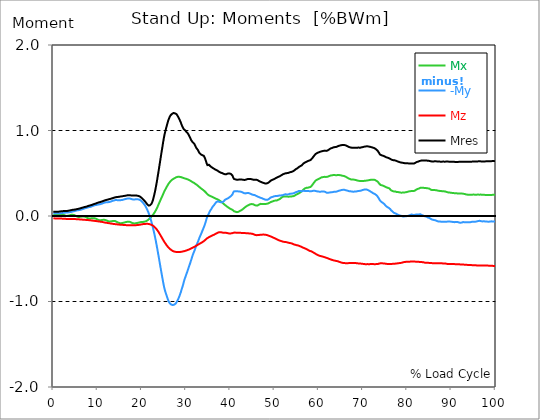
| Category |  Mx |  -My |  Mz |  Mres |
|---|---|---|---|---|
| 0.0 | 0.01 | 0.034 | -0.027 | 0.049 |
| 0.167348456675344 | 0.011 | 0.034 | -0.027 | 0.049 |
| 0.334696913350688 | 0.012 | 0.033 | -0.028 | 0.049 |
| 0.5020453700260321 | 0.014 | 0.032 | -0.028 | 0.049 |
| 0.669393826701376 | 0.016 | 0.033 | -0.028 | 0.05 |
| 0.83674228337672 | 0.016 | 0.033 | -0.028 | 0.05 |
| 1.0040907400520642 | 0.015 | 0.033 | -0.029 | 0.05 |
| 1.1621420602454444 | 0.016 | 0.032 | -0.029 | 0.05 |
| 1.3294905169207885 | 0.018 | 0.032 | -0.03 | 0.051 |
| 1.4968389735961325 | 0.02 | 0.032 | -0.03 | 0.052 |
| 1.6641874302714765 | 0.021 | 0.033 | -0.03 | 0.054 |
| 1.8315358869468206 | 0.021 | 0.033 | -0.031 | 0.054 |
| 1.9988843436221646 | 0.021 | 0.035 | -0.031 | 0.056 |
| 2.1662328002975086 | 0.018 | 0.036 | -0.032 | 0.057 |
| 2.333581256972853 | 0.014 | 0.038 | -0.032 | 0.058 |
| 2.5009297136481967 | 0.009 | 0.039 | -0.033 | 0.058 |
| 2.6682781703235405 | 0.006 | 0.039 | -0.033 | 0.057 |
| 2.8356266269988843 | 0.002 | 0.04 | -0.034 | 0.058 |
| 3.002975083674229 | 0.001 | 0.041 | -0.035 | 0.058 |
| 3.1703235403495724 | 0.001 | 0.041 | -0.035 | 0.06 |
| 3.337671997024917 | 0.003 | 0.042 | -0.036 | 0.061 |
| 3.4957233172182973 | 0.006 | 0.042 | -0.036 | 0.063 |
| 3.663071773893641 | 0.008 | 0.044 | -0.036 | 0.064 |
| 3.8304202305689854 | 0.011 | 0.045 | -0.036 | 0.066 |
| 3.997768687244329 | 0.013 | 0.047 | -0.036 | 0.068 |
| 4.165117143919673 | 0.014 | 0.05 | -0.036 | 0.07 |
| 4.332465600595017 | 0.015 | 0.052 | -0.036 | 0.072 |
| 4.499814057270361 | 0.014 | 0.054 | -0.036 | 0.073 |
| 4.667162513945706 | 0.011 | 0.056 | -0.036 | 0.074 |
| 4.834510970621049 | 0.008 | 0.059 | -0.036 | 0.075 |
| 5.001859427296393 | 0.004 | 0.061 | -0.036 | 0.077 |
| 5.169207883971737 | -0.001 | 0.064 | -0.036 | 0.078 |
| 5.336556340647081 | -0.006 | 0.065 | -0.037 | 0.08 |
| 5.503904797322425 | -0.009 | 0.066 | -0.037 | 0.081 |
| 5.671253253997769 | -0.012 | 0.068 | -0.038 | 0.084 |
| 5.82930457419115 | -0.012 | 0.069 | -0.039 | 0.086 |
| 5.996653030866494 | -0.01 | 0.071 | -0.04 | 0.089 |
| 6.164001487541838 | -0.009 | 0.074 | -0.041 | 0.091 |
| 6.331349944217181 | -0.007 | 0.076 | -0.041 | 0.093 |
| 6.498698400892526 | -0.006 | 0.079 | -0.042 | 0.096 |
| 6.66604685756787 | -0.005 | 0.081 | -0.043 | 0.099 |
| 6.833395314243213 | -0.006 | 0.085 | -0.043 | 0.102 |
| 7.000743770918558 | -0.006 | 0.088 | -0.044 | 0.105 |
| 7.168092227593902 | -0.009 | 0.091 | -0.045 | 0.107 |
| 7.335440684269246 | -0.012 | 0.093 | -0.046 | 0.107 |
| 7.50278914094459 | -0.018 | 0.096 | -0.046 | 0.11 |
| 7.6701375976199335 | -0.022 | 0.098 | -0.047 | 0.113 |
| 7.837486054295278 | -0.026 | 0.102 | -0.048 | 0.117 |
| 7.995537374488658 | -0.029 | 0.104 | -0.049 | 0.12 |
| 8.162885831164003 | -0.031 | 0.105 | -0.05 | 0.122 |
| 8.330234287839346 | -0.029 | 0.107 | -0.05 | 0.124 |
| 8.49758274451469 | -0.027 | 0.108 | -0.051 | 0.125 |
| 8.664931201190035 | -0.026 | 0.112 | -0.052 | 0.129 |
| 8.832279657865378 | -0.025 | 0.116 | -0.053 | 0.133 |
| 8.999628114540721 | -0.025 | 0.12 | -0.055 | 0.136 |
| 9.166976571216066 | -0.026 | 0.123 | -0.056 | 0.14 |
| 9.334325027891412 | -0.026 | 0.126 | -0.057 | 0.142 |
| 9.501673484566755 | -0.029 | 0.127 | -0.058 | 0.145 |
| 9.669021941242098 | -0.033 | 0.129 | -0.059 | 0.148 |
| 9.836370397917442 | -0.038 | 0.131 | -0.06 | 0.151 |
| 10.003718854592787 | -0.042 | 0.133 | -0.062 | 0.154 |
| 10.17106731126813 | -0.046 | 0.134 | -0.063 | 0.157 |
| 10.329118631461512 | -0.049 | 0.136 | -0.064 | 0.16 |
| 10.496467088136853 | -0.05 | 0.137 | -0.065 | 0.163 |
| 10.663815544812199 | -0.05 | 0.139 | -0.066 | 0.164 |
| 10.831164001487544 | -0.049 | 0.142 | -0.068 | 0.167 |
| 10.998512458162887 | -0.047 | 0.145 | -0.069 | 0.17 |
| 11.16586091483823 | -0.045 | 0.149 | -0.071 | 0.173 |
| 11.333209371513574 | -0.044 | 0.152 | -0.073 | 0.177 |
| 11.50055782818892 | -0.044 | 0.155 | -0.075 | 0.179 |
| 11.667906284864264 | -0.046 | 0.158 | -0.077 | 0.183 |
| 11.835254741539607 | -0.048 | 0.16 | -0.078 | 0.186 |
| 12.00260319821495 | -0.051 | 0.161 | -0.079 | 0.188 |
| 12.169951654890292 | -0.056 | 0.161 | -0.08 | 0.191 |
| 12.337300111565641 | -0.06 | 0.162 | -0.082 | 0.193 |
| 12.504648568240984 | -0.062 | 0.163 | -0.083 | 0.194 |
| 12.662699888434362 | -0.064 | 0.164 | -0.085 | 0.197 |
| 12.830048345109708 | -0.064 | 0.166 | -0.087 | 0.2 |
| 12.997396801785053 | -0.063 | 0.169 | -0.088 | 0.202 |
| 13.164745258460396 | -0.062 | 0.172 | -0.089 | 0.205 |
| 13.33209371513574 | -0.06 | 0.176 | -0.091 | 0.207 |
| 13.499442171811083 | -0.059 | 0.179 | -0.092 | 0.211 |
| 13.666790628486426 | -0.059 | 0.181 | -0.093 | 0.213 |
| 13.834139085161771 | -0.059 | 0.184 | -0.094 | 0.217 |
| 14.001487541837117 | -0.06 | 0.186 | -0.095 | 0.219 |
| 14.16883599851246 | -0.064 | 0.187 | -0.096 | 0.221 |
| 14.336184455187803 | -0.068 | 0.186 | -0.097 | 0.221 |
| 14.503532911863147 | -0.073 | 0.185 | -0.098 | 0.222 |
| 14.670881368538492 | -0.077 | 0.184 | -0.099 | 0.223 |
| 14.828932688731873 | -0.08 | 0.183 | -0.1 | 0.224 |
| 14.996281145407215 | -0.083 | 0.184 | -0.101 | 0.226 |
| 15.163629602082558 | -0.085 | 0.186 | -0.101 | 0.229 |
| 15.330978058757903 | -0.084 | 0.186 | -0.102 | 0.229 |
| 15.498326515433247 | -0.083 | 0.187 | -0.103 | 0.23 |
| 15.665674972108594 | -0.081 | 0.189 | -0.104 | 0.232 |
| 15.833023428783937 | -0.079 | 0.192 | -0.105 | 0.233 |
| 16.00037188545928 | -0.077 | 0.194 | -0.106 | 0.235 |
| 16.167720342134626 | -0.074 | 0.196 | -0.106 | 0.236 |
| 16.335068798809967 | -0.072 | 0.199 | -0.107 | 0.237 |
| 16.502417255485312 | -0.07 | 0.201 | -0.107 | 0.239 |
| 16.669765712160658 | -0.068 | 0.203 | -0.107 | 0.241 |
| 16.837114168836 | -0.067 | 0.205 | -0.108 | 0.242 |
| 17.004462625511344 | -0.067 | 0.206 | -0.108 | 0.243 |
| 17.16251394570472 | -0.067 | 0.206 | -0.108 | 0.243 |
| 17.32986240238007 | -0.069 | 0.204 | -0.108 | 0.242 |
| 17.497210859055414 | -0.073 | 0.201 | -0.108 | 0.241 |
| 17.664559315730756 | -0.078 | 0.198 | -0.108 | 0.24 |
| 17.8319077724061 | -0.081 | 0.196 | -0.108 | 0.239 |
| 17.999256229081443 | -0.085 | 0.193 | -0.108 | 0.238 |
| 18.166604685756788 | -0.088 | 0.192 | -0.108 | 0.238 |
| 18.333953142432133 | -0.087 | 0.193 | -0.108 | 0.239 |
| 18.501301599107478 | -0.086 | 0.194 | -0.107 | 0.239 |
| 18.668650055782823 | -0.084 | 0.196 | -0.107 | 0.24 |
| 18.835998512458165 | -0.083 | 0.195 | -0.107 | 0.238 |
| 19.00334696913351 | -0.081 | 0.195 | -0.106 | 0.237 |
| 19.170695425808855 | -0.079 | 0.196 | -0.105 | 0.236 |
| 19.338043882484197 | -0.077 | 0.193 | -0.104 | 0.234 |
| 19.496095202677576 | -0.075 | 0.192 | -0.102 | 0.231 |
| 19.66344365935292 | -0.072 | 0.186 | -0.101 | 0.224 |
| 19.830792116028263 | -0.07 | 0.179 | -0.099 | 0.218 |
| 19.998140572703612 | -0.07 | 0.17 | -0.097 | 0.209 |
| 20.165489029378953 | -0.069 | 0.16 | -0.096 | 0.201 |
| 20.3328374860543 | -0.069 | 0.15 | -0.094 | 0.193 |
| 20.500185942729644 | -0.067 | 0.14 | -0.093 | 0.183 |
| 20.667534399404985 | -0.065 | 0.128 | -0.093 | 0.174 |
| 20.83488285608033 | -0.063 | 0.114 | -0.093 | 0.164 |
| 21.002231312755672 | -0.06 | 0.098 | -0.092 | 0.152 |
| 21.16957976943102 | -0.054 | 0.08 | -0.092 | 0.14 |
| 21.336928226106362 | -0.049 | 0.061 | -0.092 | 0.13 |
| 21.504276682781704 | -0.042 | 0.04 | -0.093 | 0.123 |
| 21.67162513945705 | -0.035 | 0.017 | -0.094 | 0.121 |
| 21.82967645965043 | -0.026 | -0.009 | -0.097 | 0.124 |
| 21.997024916325774 | -0.018 | -0.037 | -0.1 | 0.13 |
| 22.16437337300112 | -0.008 | -0.066 | -0.103 | 0.141 |
| 22.33172182967646 | 0.002 | -0.099 | -0.107 | 0.16 |
| 22.499070286351806 | 0.012 | -0.133 | -0.113 | 0.184 |
| 22.666418743027148 | 0.024 | -0.17 | -0.119 | 0.216 |
| 22.833767199702496 | 0.037 | -0.208 | -0.126 | 0.251 |
| 23.00111565637784 | 0.051 | -0.25 | -0.135 | 0.292 |
| 23.168464113053183 | 0.066 | -0.292 | -0.144 | 0.336 |
| 23.335812569728528 | 0.083 | -0.337 | -0.154 | 0.382 |
| 23.50316102640387 | 0.101 | -0.384 | -0.165 | 0.433 |
| 23.670509483079215 | 0.121 | -0.434 | -0.179 | 0.487 |
| 23.83785793975456 | 0.141 | -0.481 | -0.192 | 0.539 |
| 23.995909259947936 | 0.161 | -0.533 | -0.207 | 0.594 |
| 24.163257716623285 | 0.18 | -0.582 | -0.221 | 0.65 |
| 24.330606173298627 | 0.2 | -0.633 | -0.236 | 0.706 |
| 24.49795462997397 | 0.219 | -0.681 | -0.25 | 0.759 |
| 24.665303086649313 | 0.237 | -0.729 | -0.265 | 0.812 |
| 24.83265154332466 | 0.258 | -0.778 | -0.28 | 0.867 |
| 25.0 | 0.278 | -0.821 | -0.295 | 0.917 |
| 25.167348456675345 | 0.295 | -0.858 | -0.308 | 0.959 |
| 25.334696913350694 | 0.312 | -0.889 | -0.321 | 0.996 |
| 25.502045370026035 | 0.328 | -0.915 | -0.334 | 1.028 |
| 25.669393826701377 | 0.344 | -0.94 | -0.346 | 1.06 |
| 25.836742283376722 | 0.359 | -0.966 | -0.357 | 1.092 |
| 26.004090740052067 | 0.374 | -0.99 | -0.367 | 1.121 |
| 26.17143919672741 | 0.386 | -1.007 | -0.376 | 1.143 |
| 26.329490516920792 | 0.397 | -1.021 | -0.384 | 1.163 |
| 26.49683897359613 | 0.407 | -1.032 | -0.392 | 1.178 |
| 26.66418743027148 | 0.416 | -1.036 | -0.398 | 1.187 |
| 26.831535886946828 | 0.423 | -1.04 | -0.404 | 1.194 |
| 26.998884343622166 | 0.43 | -1.042 | -0.409 | 1.201 |
| 27.166232800297514 | 0.436 | -1.042 | -0.412 | 1.205 |
| 27.333581256972852 | 0.44 | -1.036 | -0.416 | 1.202 |
| 27.5009297136482 | 0.445 | -1.032 | -0.418 | 1.201 |
| 27.668278170323543 | 0.45 | -1.023 | -0.42 | 1.196 |
| 27.835626626998888 | 0.454 | -1.015 | -0.421 | 1.192 |
| 28.002975083674233 | 0.457 | -0.996 | -0.421 | 1.179 |
| 28.170323540349575 | 0.459 | -0.979 | -0.422 | 1.164 |
| 28.33767199702492 | 0.459 | -0.959 | -0.422 | 1.149 |
| 28.50502045370026 | 0.458 | -0.938 | -0.421 | 1.132 |
| 28.663071773893645 | 0.456 | -0.912 | -0.421 | 1.11 |
| 28.830420230568986 | 0.455 | -0.891 | -0.419 | 1.093 |
| 28.99776868724433 | 0.451 | -0.857 | -0.418 | 1.066 |
| 29.165117143919673 | 0.45 | -0.833 | -0.416 | 1.048 |
| 29.33246560059502 | 0.447 | -0.803 | -0.414 | 1.03 |
| 29.499814057270367 | 0.443 | -0.769 | -0.412 | 1.015 |
| 29.66716251394571 | 0.439 | -0.74 | -0.41 | 1.006 |
| 29.834510970621054 | 0.437 | -0.716 | -0.407 | 1.001 |
| 30.00185942729639 | 0.435 | -0.692 | -0.405 | 0.989 |
| 30.169207883971744 | 0.433 | -0.667 | -0.401 | 0.981 |
| 30.33655634064708 | 0.429 | -0.642 | -0.398 | 0.971 |
| 30.50390479732243 | 0.425 | -0.618 | -0.395 | 0.959 |
| 30.671253253997772 | 0.421 | -0.592 | -0.392 | 0.941 |
| 30.829304574191156 | 0.417 | -0.566 | -0.388 | 0.923 |
| 30.996653030866494 | 0.412 | -0.54 | -0.383 | 0.907 |
| 31.164001487541842 | 0.407 | -0.513 | -0.379 | 0.887 |
| 31.331349944217187 | 0.401 | -0.486 | -0.375 | 0.875 |
| 31.498698400892525 | 0.395 | -0.459 | -0.371 | 0.863 |
| 31.666046857567874 | 0.391 | -0.436 | -0.366 | 0.852 |
| 31.833395314243212 | 0.386 | -0.415 | -0.362 | 0.846 |
| 32.00074377091856 | 0.381 | -0.393 | -0.357 | 0.832 |
| 32.1680922275939 | 0.374 | -0.365 | -0.352 | 0.811 |
| 32.33544068426925 | 0.366 | -0.341 | -0.348 | 0.795 |
| 32.50278914094459 | 0.362 | -0.324 | -0.342 | 0.787 |
| 32.670137597619934 | 0.355 | -0.304 | -0.336 | 0.773 |
| 32.83748605429528 | 0.347 | -0.281 | -0.332 | 0.755 |
| 33.004834510970625 | 0.34 | -0.258 | -0.326 | 0.739 |
| 33.162885831164004 | 0.332 | -0.237 | -0.321 | 0.728 |
| 33.33023428783935 | 0.324 | -0.219 | -0.317 | 0.721 |
| 33.497582744514695 | 0.319 | -0.198 | -0.312 | 0.715 |
| 33.664931201190036 | 0.312 | -0.177 | -0.307 | 0.711 |
| 33.83227965786538 | 0.306 | -0.155 | -0.301 | 0.708 |
| 33.99962811454073 | 0.299 | -0.135 | -0.295 | 0.705 |
| 34.16697657121607 | 0.292 | -0.112 | -0.288 | 0.689 |
| 34.33432502789141 | 0.284 | -0.087 | -0.28 | 0.668 |
| 34.50167348456676 | 0.274 | -0.058 | -0.272 | 0.643 |
| 34.6690219412421 | 0.264 | -0.028 | -0.264 | 0.615 |
| 34.83637039791744 | 0.254 | -0.003 | -0.258 | 0.595 |
| 35.00371885459279 | 0.249 | 0.014 | -0.253 | 0.596 |
| 35.17106731126814 | 0.242 | 0.03 | -0.249 | 0.599 |
| 35.338415767943474 | 0.236 | 0.051 | -0.243 | 0.589 |
| 35.49646708813686 | 0.233 | 0.065 | -0.238 | 0.582 |
| 35.6638155448122 | 0.232 | 0.078 | -0.235 | 0.578 |
| 35.831164001487544 | 0.226 | 0.093 | -0.23 | 0.568 |
| 35.998512458162885 | 0.221 | 0.107 | -0.226 | 0.559 |
| 36.165860914838234 | 0.218 | 0.117 | -0.222 | 0.558 |
| 36.333209371513576 | 0.213 | 0.127 | -0.219 | 0.556 |
| 36.50055782818892 | 0.208 | 0.14 | -0.214 | 0.547 |
| 36.667906284864266 | 0.205 | 0.151 | -0.209 | 0.541 |
| 36.83525474153961 | 0.201 | 0.163 | -0.205 | 0.538 |
| 37.002603198214956 | 0.198 | 0.172 | -0.2 | 0.535 |
| 37.1699516548903 | 0.193 | 0.172 | -0.196 | 0.529 |
| 37.337300111565646 | 0.189 | 0.168 | -0.192 | 0.521 |
| 37.50464856824098 | 0.183 | 0.165 | -0.19 | 0.516 |
| 37.66269988843437 | 0.178 | 0.164 | -0.19 | 0.511 |
| 37.83004834510971 | 0.172 | 0.162 | -0.19 | 0.507 |
| 37.99739680178505 | 0.165 | 0.163 | -0.191 | 0.506 |
| 38.16474525846039 | 0.158 | 0.162 | -0.193 | 0.502 |
| 38.33209371513574 | 0.15 | 0.164 | -0.195 | 0.498 |
| 38.49944217181109 | 0.142 | 0.171 | -0.197 | 0.493 |
| 38.666790628486424 | 0.135 | 0.18 | -0.197 | 0.489 |
| 38.83413908516178 | 0.128 | 0.191 | -0.196 | 0.488 |
| 39.001487541837115 | 0.121 | 0.197 | -0.196 | 0.489 |
| 39.16883599851246 | 0.114 | 0.199 | -0.198 | 0.49 |
| 39.336184455187805 | 0.108 | 0.204 | -0.199 | 0.493 |
| 39.503532911863154 | 0.102 | 0.207 | -0.202 | 0.498 |
| 39.670881368538495 | 0.094 | 0.213 | -0.204 | 0.5 |
| 39.83822982521384 | 0.09 | 0.221 | -0.205 | 0.498 |
| 39.996281145407224 | 0.085 | 0.229 | -0.204 | 0.494 |
| 40.163629602082565 | 0.08 | 0.234 | -0.204 | 0.491 |
| 40.33097805875791 | 0.076 | 0.236 | -0.203 | 0.485 |
| 40.498326515433256 | 0.072 | 0.253 | -0.202 | 0.472 |
| 40.6656749721086 | 0.064 | 0.275 | -0.197 | 0.45 |
| 40.83302342878393 | 0.056 | 0.288 | -0.193 | 0.434 |
| 41.00037188545929 | 0.052 | 0.289 | -0.193 | 0.429 |
| 41.16772034213463 | 0.05 | 0.289 | -0.195 | 0.428 |
| 41.33506879880997 | 0.048 | 0.289 | -0.195 | 0.426 |
| 41.50241725548531 | 0.045 | 0.29 | -0.195 | 0.424 |
| 41.66976571216066 | 0.047 | 0.289 | -0.195 | 0.423 |
| 41.837114168836 | 0.049 | 0.288 | -0.196 | 0.425 |
| 42.004462625511344 | 0.053 | 0.289 | -0.196 | 0.426 |
| 42.17181108218669 | 0.059 | 0.287 | -0.196 | 0.427 |
| 42.32986240238007 | 0.065 | 0.283 | -0.197 | 0.427 |
| 42.497210859055414 | 0.067 | 0.282 | -0.197 | 0.427 |
| 42.66455931573076 | 0.074 | 0.279 | -0.198 | 0.425 |
| 42.831907772406105 | 0.08 | 0.275 | -0.198 | 0.424 |
| 42.999256229081446 | 0.087 | 0.27 | -0.198 | 0.422 |
| 43.16660468575679 | 0.094 | 0.266 | -0.199 | 0.421 |
| 43.33395314243214 | 0.102 | 0.263 | -0.2 | 0.421 |
| 43.50130159910748 | 0.108 | 0.264 | -0.201 | 0.424 |
| 43.66865005578282 | 0.114 | 0.267 | -0.201 | 0.427 |
| 43.83599851245817 | 0.12 | 0.269 | -0.202 | 0.431 |
| 44.00334696913351 | 0.124 | 0.27 | -0.203 | 0.434 |
| 44.17069542580886 | 0.129 | 0.268 | -0.203 | 0.434 |
| 44.3380438824842 | 0.133 | 0.264 | -0.204 | 0.433 |
| 44.49609520267758 | 0.136 | 0.262 | -0.205 | 0.434 |
| 44.66344365935292 | 0.139 | 0.258 | -0.206 | 0.433 |
| 44.83079211602827 | 0.139 | 0.253 | -0.207 | 0.43 |
| 44.99814057270361 | 0.14 | 0.25 | -0.208 | 0.427 |
| 45.16548902937895 | 0.138 | 0.248 | -0.21 | 0.425 |
| 45.332837486054295 | 0.133 | 0.247 | -0.215 | 0.424 |
| 45.500185942729644 | 0.128 | 0.245 | -0.22 | 0.425 |
| 45.66753439940499 | 0.125 | 0.241 | -0.222 | 0.426 |
| 45.83488285608033 | 0.122 | 0.236 | -0.223 | 0.425 |
| 46.00223131275568 | 0.122 | 0.231 | -0.224 | 0.421 |
| 46.16957976943102 | 0.122 | 0.228 | -0.223 | 0.42 |
| 46.336928226106366 | 0.127 | 0.224 | -0.222 | 0.415 |
| 46.50427668278171 | 0.134 | 0.221 | -0.221 | 0.409 |
| 46.671625139457056 | 0.139 | 0.217 | -0.221 | 0.406 |
| 46.829676459650436 | 0.142 | 0.213 | -0.22 | 0.401 |
| 46.99702491632577 | 0.142 | 0.208 | -0.219 | 0.396 |
| 47.16437337300112 | 0.139 | 0.207 | -0.218 | 0.393 |
| 47.33172182967646 | 0.139 | 0.204 | -0.218 | 0.39 |
| 47.49907028635181 | 0.139 | 0.2 | -0.218 | 0.387 |
| 47.66641874302716 | 0.139 | 0.196 | -0.218 | 0.384 |
| 47.83376719970249 | 0.14 | 0.193 | -0.219 | 0.381 |
| 48.001115656377834 | 0.141 | 0.19 | -0.22 | 0.379 |
| 48.16846411305319 | 0.142 | 0.189 | -0.221 | 0.38 |
| 48.33581256972853 | 0.142 | 0.19 | -0.223 | 0.382 |
| 48.50316102640387 | 0.146 | 0.192 | -0.226 | 0.386 |
| 48.67050948307921 | 0.15 | 0.195 | -0.23 | 0.391 |
| 48.837857939754564 | 0.154 | 0.203 | -0.233 | 0.398 |
| 49.005206396429905 | 0.159 | 0.21 | -0.236 | 0.406 |
| 49.163257716623285 | 0.164 | 0.218 | -0.239 | 0.414 |
| 49.33060617329863 | 0.166 | 0.221 | -0.243 | 0.419 |
| 49.49795462997397 | 0.169 | 0.222 | -0.248 | 0.422 |
| 49.66530308664932 | 0.174 | 0.227 | -0.251 | 0.426 |
| 49.832651543324666 | 0.177 | 0.229 | -0.255 | 0.43 |
| 50.0 | 0.178 | 0.23 | -0.259 | 0.435 |
| 50.16734845667534 | 0.18 | 0.233 | -0.263 | 0.439 |
| 50.33469691335069 | 0.18 | 0.234 | -0.267 | 0.444 |
| 50.50204537002604 | 0.181 | 0.234 | -0.272 | 0.449 |
| 50.66939382670139 | 0.184 | 0.235 | -0.277 | 0.453 |
| 50.836742283376715 | 0.19 | 0.236 | -0.28 | 0.457 |
| 51.00409074005207 | 0.193 | 0.236 | -0.284 | 0.461 |
| 51.17143919672741 | 0.197 | 0.241 | -0.287 | 0.464 |
| 51.32949051692079 | 0.201 | 0.246 | -0.29 | 0.469 |
| 51.496838973596134 | 0.211 | 0.241 | -0.293 | 0.475 |
| 51.66418743027148 | 0.221 | 0.241 | -0.296 | 0.482 |
| 51.831535886946824 | 0.224 | 0.243 | -0.299 | 0.486 |
| 51.99888434362217 | 0.227 | 0.246 | -0.301 | 0.49 |
| 52.16623280029752 | 0.228 | 0.25 | -0.302 | 0.493 |
| 52.33358125697285 | 0.229 | 0.251 | -0.304 | 0.496 |
| 52.5009297136482 | 0.229 | 0.254 | -0.305 | 0.499 |
| 52.668278170323546 | 0.228 | 0.253 | -0.306 | 0.501 |
| 52.835626626998895 | 0.227 | 0.251 | -0.307 | 0.502 |
| 53.00297508367424 | 0.227 | 0.251 | -0.31 | 0.503 |
| 53.17032354034958 | 0.226 | 0.253 | -0.312 | 0.505 |
| 53.33767199702492 | 0.226 | 0.258 | -0.315 | 0.509 |
| 53.50502045370027 | 0.227 | 0.261 | -0.316 | 0.512 |
| 53.663071773893655 | 0.228 | 0.262 | -0.318 | 0.514 |
| 53.83042023056899 | 0.229 | 0.262 | -0.321 | 0.516 |
| 53.99776868724433 | 0.23 | 0.263 | -0.322 | 0.519 |
| 54.16511714391967 | 0.231 | 0.264 | -0.326 | 0.522 |
| 54.33246560059503 | 0.233 | 0.266 | -0.331 | 0.527 |
| 54.49981405727037 | 0.236 | 0.27 | -0.335 | 0.534 |
| 54.667162513945705 | 0.242 | 0.276 | -0.336 | 0.542 |
| 54.834510970621054 | 0.248 | 0.279 | -0.338 | 0.549 |
| 55.0018594272964 | 0.251 | 0.28 | -0.341 | 0.553 |
| 55.169207883971744 | 0.256 | 0.283 | -0.343 | 0.558 |
| 55.336556340647086 | 0.261 | 0.29 | -0.345 | 0.566 |
| 55.50390479732243 | 0.265 | 0.293 | -0.348 | 0.572 |
| 55.671253253997776 | 0.271 | 0.294 | -0.351 | 0.579 |
| 55.83860171067312 | 0.277 | 0.293 | -0.355 | 0.583 |
| 55.9966530308665 | 0.282 | 0.289 | -0.358 | 0.586 |
| 56.16400148754184 | 0.29 | 0.288 | -0.363 | 0.593 |
| 56.33134994421718 | 0.297 | 0.293 | -0.367 | 0.602 |
| 56.498698400892536 | 0.307 | 0.295 | -0.371 | 0.612 |
| 56.66604685756788 | 0.316 | 0.296 | -0.375 | 0.621 |
| 56.83339531424321 | 0.321 | 0.293 | -0.378 | 0.624 |
| 57.00074377091856 | 0.326 | 0.293 | -0.381 | 0.629 |
| 57.16809222759391 | 0.329 | 0.293 | -0.385 | 0.633 |
| 57.33544068426925 | 0.33 | 0.293 | -0.39 | 0.637 |
| 57.5027891409446 | 0.33 | 0.293 | -0.396 | 0.641 |
| 57.670137597619934 | 0.334 | 0.293 | -0.4 | 0.647 |
| 57.83748605429528 | 0.336 | 0.291 | -0.404 | 0.649 |
| 58.004834510970625 | 0.337 | 0.289 | -0.408 | 0.65 |
| 58.16288583116401 | 0.34 | 0.289 | -0.411 | 0.655 |
| 58.330234287839346 | 0.349 | 0.289 | -0.413 | 0.662 |
| 58.497582744514695 | 0.36 | 0.292 | -0.418 | 0.673 |
| 58.66493120119004 | 0.371 | 0.294 | -0.423 | 0.685 |
| 58.832279657865385 | 0.383 | 0.295 | -0.428 | 0.696 |
| 58.999628114540734 | 0.395 | 0.294 | -0.433 | 0.707 |
| 59.16697657121607 | 0.406 | 0.294 | -0.438 | 0.718 |
| 59.33432502789142 | 0.416 | 0.292 | -0.444 | 0.727 |
| 59.50167348456676 | 0.421 | 0.29 | -0.449 | 0.732 |
| 59.66902194124211 | 0.425 | 0.289 | -0.453 | 0.736 |
| 59.83637039791745 | 0.43 | 0.287 | -0.457 | 0.741 |
| 60.00371885459278 | 0.435 | 0.285 | -0.462 | 0.745 |
| 60.17106731126813 | 0.438 | 0.284 | -0.464 | 0.748 |
| 60.33841576794349 | 0.443 | 0.285 | -0.467 | 0.751 |
| 60.49646708813685 | 0.45 | 0.285 | -0.47 | 0.754 |
| 60.6638155448122 | 0.452 | 0.286 | -0.472 | 0.757 |
| 60.831164001487544 | 0.454 | 0.287 | -0.474 | 0.759 |
| 60.99851245816289 | 0.455 | 0.288 | -0.476 | 0.761 |
| 61.16586091483824 | 0.457 | 0.287 | -0.479 | 0.763 |
| 61.333209371513576 | 0.458 | 0.286 | -0.482 | 0.764 |
| 61.50055782818892 | 0.457 | 0.281 | -0.485 | 0.763 |
| 61.667906284864266 | 0.457 | 0.274 | -0.488 | 0.762 |
| 61.835254741539615 | 0.458 | 0.271 | -0.491 | 0.764 |
| 62.002603198214956 | 0.459 | 0.271 | -0.493 | 0.766 |
| 62.16995165489029 | 0.464 | 0.273 | -0.497 | 0.773 |
| 62.33730011156564 | 0.466 | 0.273 | -0.501 | 0.778 |
| 62.504648568240995 | 0.469 | 0.275 | -0.505 | 0.783 |
| 62.67199702491633 | 0.474 | 0.278 | -0.507 | 0.79 |
| 62.83004834510971 | 0.475 | 0.279 | -0.51 | 0.793 |
| 62.99739680178505 | 0.476 | 0.279 | -0.513 | 0.795 |
| 63.1647452584604 | 0.478 | 0.279 | -0.516 | 0.799 |
| 63.33209371513575 | 0.479 | 0.283 | -0.519 | 0.803 |
| 63.4994421718111 | 0.479 | 0.284 | -0.521 | 0.806 |
| 63.666790628486424 | 0.479 | 0.284 | -0.522 | 0.807 |
| 63.83413908516177 | 0.477 | 0.283 | -0.524 | 0.807 |
| 64.00148754183712 | 0.477 | 0.284 | -0.526 | 0.808 |
| 64.16883599851248 | 0.478 | 0.288 | -0.528 | 0.812 |
| 64.3361844551878 | 0.479 | 0.293 | -0.53 | 0.817 |
| 64.50353291186315 | 0.479 | 0.294 | -0.534 | 0.821 |
| 64.6708813685385 | 0.479 | 0.297 | -0.536 | 0.822 |
| 64.83822982521384 | 0.477 | 0.299 | -0.539 | 0.824 |
| 65.00557828188919 | 0.476 | 0.301 | -0.542 | 0.827 |
| 65.16362960208257 | 0.474 | 0.304 | -0.545 | 0.829 |
| 65.3309780587579 | 0.471 | 0.306 | -0.548 | 0.831 |
| 65.49832651543326 | 0.469 | 0.307 | -0.55 | 0.832 |
| 65.6656749721086 | 0.468 | 0.307 | -0.55 | 0.831 |
| 65.83302342878395 | 0.464 | 0.306 | -0.55 | 0.83 |
| 66.00037188545929 | 0.462 | 0.305 | -0.551 | 0.828 |
| 66.16772034213463 | 0.457 | 0.301 | -0.551 | 0.824 |
| 66.33506879880998 | 0.452 | 0.299 | -0.551 | 0.821 |
| 66.50241725548531 | 0.447 | 0.296 | -0.551 | 0.816 |
| 66.66976571216065 | 0.442 | 0.294 | -0.551 | 0.812 |
| 66.83711416883601 | 0.437 | 0.291 | -0.551 | 0.807 |
| 67.00446262551135 | 0.434 | 0.289 | -0.55 | 0.804 |
| 67.1718110821867 | 0.43 | 0.289 | -0.549 | 0.801 |
| 67.32986240238007 | 0.427 | 0.288 | -0.549 | 0.8 |
| 67.49721085905541 | 0.427 | 0.286 | -0.549 | 0.799 |
| 67.66455931573076 | 0.426 | 0.284 | -0.549 | 0.798 |
| 67.83190777240611 | 0.425 | 0.284 | -0.549 | 0.798 |
| 67.99925622908145 | 0.425 | 0.285 | -0.55 | 0.798 |
| 68.16660468575678 | 0.423 | 0.286 | -0.55 | 0.799 |
| 68.33395314243214 | 0.421 | 0.287 | -0.55 | 0.798 |
| 68.50130159910749 | 0.419 | 0.287 | -0.551 | 0.798 |
| 68.66865005578282 | 0.416 | 0.288 | -0.552 | 0.798 |
| 68.83599851245816 | 0.414 | 0.292 | -0.554 | 0.799 |
| 69.00334696913352 | 0.412 | 0.294 | -0.555 | 0.801 |
| 69.17069542580886 | 0.411 | 0.293 | -0.555 | 0.8 |
| 69.3380438824842 | 0.409 | 0.293 | -0.555 | 0.798 |
| 69.50539233915956 | 0.408 | 0.295 | -0.557 | 0.8 |
| 69.66344365935292 | 0.409 | 0.299 | -0.558 | 0.803 |
| 69.83079211602826 | 0.408 | 0.303 | -0.559 | 0.805 |
| 69.99814057270362 | 0.409 | 0.306 | -0.56 | 0.807 |
| 70.16548902937896 | 0.41 | 0.307 | -0.561 | 0.809 |
| 70.33283748605429 | 0.411 | 0.309 | -0.563 | 0.811 |
| 70.50018594272964 | 0.411 | 0.311 | -0.563 | 0.813 |
| 70.667534399405 | 0.413 | 0.31 | -0.564 | 0.814 |
| 70.83488285608033 | 0.414 | 0.309 | -0.564 | 0.815 |
| 71.00223131275568 | 0.416 | 0.307 | -0.563 | 0.815 |
| 71.16957976943102 | 0.417 | 0.303 | -0.564 | 0.813 |
| 71.33692822610637 | 0.419 | 0.299 | -0.564 | 0.812 |
| 71.50427668278171 | 0.421 | 0.293 | -0.564 | 0.81 |
| 71.67162513945706 | 0.422 | 0.288 | -0.563 | 0.808 |
| 71.8389735961324 | 0.424 | 0.282 | -0.563 | 0.807 |
| 71.99702491632577 | 0.425 | 0.277 | -0.563 | 0.804 |
| 72.16437337300113 | 0.424 | 0.271 | -0.563 | 0.8 |
| 72.33172182967647 | 0.424 | 0.266 | -0.563 | 0.798 |
| 72.49907028635181 | 0.423 | 0.262 | -0.563 | 0.794 |
| 72.66641874302715 | 0.422 | 0.257 | -0.564 | 0.792 |
| 72.8337671997025 | 0.419 | 0.252 | -0.564 | 0.787 |
| 73.00111565637783 | 0.413 | 0.246 | -0.563 | 0.779 |
| 73.16846411305319 | 0.407 | 0.237 | -0.563 | 0.771 |
| 73.33581256972853 | 0.402 | 0.226 | -0.563 | 0.763 |
| 73.50316102640387 | 0.392 | 0.213 | -0.56 | 0.75 |
| 73.67050948307921 | 0.379 | 0.198 | -0.556 | 0.736 |
| 73.83785793975457 | 0.368 | 0.183 | -0.553 | 0.721 |
| 74.00520639642991 | 0.363 | 0.173 | -0.553 | 0.714 |
| 74.16325771662328 | 0.36 | 0.165 | -0.553 | 0.711 |
| 74.33060617329863 | 0.358 | 0.16 | -0.553 | 0.709 |
| 74.49795462997398 | 0.355 | 0.153 | -0.554 | 0.706 |
| 74.66530308664932 | 0.352 | 0.147 | -0.555 | 0.703 |
| 74.83265154332466 | 0.348 | 0.139 | -0.556 | 0.699 |
| 75.00000000000001 | 0.343 | 0.129 | -0.557 | 0.693 |
| 75.16734845667534 | 0.338 | 0.119 | -0.558 | 0.689 |
| 75.3346969133507 | 0.335 | 0.111 | -0.56 | 0.686 |
| 75.50204537002605 | 0.331 | 0.105 | -0.561 | 0.683 |
| 75.66939382670138 | 0.329 | 0.101 | -0.561 | 0.681 |
| 75.83674228337672 | 0.326 | 0.095 | -0.561 | 0.678 |
| 76.00409074005208 | 0.321 | 0.089 | -0.561 | 0.674 |
| 76.17143919672742 | 0.314 | 0.081 | -0.562 | 0.668 |
| 76.33878765340276 | 0.301 | 0.068 | -0.561 | 0.661 |
| 76.49683897359614 | 0.295 | 0.06 | -0.561 | 0.658 |
| 76.66418743027148 | 0.293 | 0.053 | -0.56 | 0.656 |
| 76.83153588694682 | 0.289 | 0.045 | -0.559 | 0.653 |
| 76.99888434362218 | 0.287 | 0.037 | -0.558 | 0.651 |
| 77.16623280029752 | 0.288 | 0.035 | -0.558 | 0.651 |
| 77.33358125697285 | 0.287 | 0.031 | -0.557 | 0.65 |
| 77.5009297136482 | 0.282 | 0.027 | -0.555 | 0.646 |
| 77.66827817032356 | 0.279 | 0.021 | -0.555 | 0.642 |
| 77.83562662699889 | 0.277 | 0.019 | -0.554 | 0.638 |
| 78.00297508367423 | 0.279 | 0.013 | -0.552 | 0.636 |
| 78.17032354034959 | 0.278 | 0.008 | -0.551 | 0.633 |
| 78.33767199702493 | 0.276 | 0.006 | -0.55 | 0.63 |
| 78.50502045370027 | 0.274 | 0.004 | -0.55 | 0.626 |
| 78.67236891037561 | 0.273 | 0.002 | -0.548 | 0.624 |
| 78.83042023056899 | 0.273 | -0.003 | -0.545 | 0.623 |
| 78.99776868724433 | 0.274 | -0.005 | -0.543 | 0.623 |
| 79.16511714391969 | 0.275 | -0.005 | -0.541 | 0.621 |
| 79.33246560059503 | 0.275 | -0.005 | -0.538 | 0.619 |
| 79.49981405727036 | 0.277 | -0.004 | -0.537 | 0.617 |
| 79.66716251394571 | 0.278 | -0.003 | -0.536 | 0.616 |
| 79.83451097062107 | 0.279 | -0.002 | -0.536 | 0.616 |
| 80.00185942729641 | 0.281 | -0.001 | -0.536 | 0.616 |
| 80.16920788397174 | 0.285 | -0.001 | -0.535 | 0.616 |
| 80.33655634064709 | 0.287 | 0.004 | -0.535 | 0.615 |
| 80.50390479732243 | 0.288 | 0.008 | -0.534 | 0.614 |
| 80.67125325399778 | 0.29 | 0.011 | -0.534 | 0.614 |
| 80.83860171067312 | 0.293 | 0.014 | -0.533 | 0.614 |
| 80.99665303086651 | 0.293 | 0.018 | -0.533 | 0.614 |
| 81.16400148754184 | 0.293 | 0.018 | -0.533 | 0.614 |
| 81.3313499442172 | 0.293 | 0.013 | -0.533 | 0.614 |
| 81.49869840089255 | 0.293 | 0.01 | -0.533 | 0.613 |
| 81.66604685756786 | 0.294 | 0.013 | -0.533 | 0.616 |
| 81.83339531424322 | 0.3 | 0.017 | -0.534 | 0.621 |
| 82.00074377091858 | 0.307 | 0.017 | -0.535 | 0.627 |
| 82.16809222759392 | 0.312 | 0.016 | -0.536 | 0.632 |
| 82.33544068426926 | 0.316 | 0.017 | -0.536 | 0.634 |
| 82.50278914094459 | 0.319 | 0.018 | -0.536 | 0.636 |
| 82.67013759761994 | 0.321 | 0.019 | -0.536 | 0.638 |
| 82.83748605429528 | 0.326 | 0.021 | -0.537 | 0.644 |
| 83.00483451097062 | 0.33 | 0.021 | -0.539 | 0.647 |
| 83.17218296764597 | 0.331 | 0.017 | -0.539 | 0.648 |
| 83.33023428783935 | 0.33 | 0.01 | -0.539 | 0.648 |
| 83.4975827445147 | 0.33 | 0.006 | -0.54 | 0.648 |
| 83.66493120119004 | 0.33 | 0.004 | -0.541 | 0.649 |
| 83.83227965786537 | 0.329 | 0 | -0.544 | 0.649 |
| 83.99962811454073 | 0.327 | -0.004 | -0.546 | 0.649 |
| 84.16697657121607 | 0.326 | -0.006 | -0.547 | 0.648 |
| 84.33432502789142 | 0.326 | -0.007 | -0.548 | 0.648 |
| 84.50167348456677 | 0.325 | -0.012 | -0.548 | 0.648 |
| 84.6690219412421 | 0.323 | -0.018 | -0.548 | 0.648 |
| 84.83637039791745 | 0.322 | -0.021 | -0.548 | 0.647 |
| 85.0037188545928 | 0.321 | -0.022 | -0.549 | 0.646 |
| 85.17106731126813 | 0.314 | -0.028 | -0.55 | 0.642 |
| 85.33841576794349 | 0.308 | -0.034 | -0.55 | 0.639 |
| 85.50576422461883 | 0.306 | -0.037 | -0.55 | 0.638 |
| 85.66381554481221 | 0.303 | -0.042 | -0.551 | 0.637 |
| 85.83116400148755 | 0.302 | -0.046 | -0.551 | 0.637 |
| 85.99851245816289 | 0.303 | -0.047 | -0.552 | 0.638 |
| 86.16586091483823 | 0.304 | -0.047 | -0.552 | 0.639 |
| 86.33320937151358 | 0.303 | -0.05 | -0.552 | 0.639 |
| 86.50055782818893 | 0.302 | -0.053 | -0.553 | 0.639 |
| 86.66790628486427 | 0.3 | -0.057 | -0.553 | 0.639 |
| 86.83525474153961 | 0.299 | -0.06 | -0.553 | 0.638 |
| 87.00260319821496 | 0.296 | -0.064 | -0.553 | 0.637 |
| 87.16995165489031 | 0.294 | -0.064 | -0.553 | 0.637 |
| 87.33730011156564 | 0.293 | -0.064 | -0.553 | 0.636 |
| 87.504648568241 | 0.293 | -0.065 | -0.553 | 0.636 |
| 87.67199702491634 | 0.292 | -0.066 | -0.553 | 0.636 |
| 87.83004834510972 | 0.29 | -0.068 | -0.553 | 0.636 |
| 87.99739680178506 | 0.29 | -0.068 | -0.554 | 0.636 |
| 88.1647452584604 | 0.29 | -0.066 | -0.555 | 0.636 |
| 88.33209371513574 | 0.289 | -0.066 | -0.555 | 0.636 |
| 88.49944217181108 | 0.287 | -0.066 | -0.556 | 0.636 |
| 88.66679062848644 | 0.286 | -0.066 | -0.556 | 0.636 |
| 88.83413908516178 | 0.284 | -0.066 | -0.557 | 0.636 |
| 89.00148754183712 | 0.279 | -0.066 | -0.56 | 0.636 |
| 89.16883599851246 | 0.278 | -0.064 | -0.562 | 0.636 |
| 89.33618445518782 | 0.276 | -0.064 | -0.563 | 0.636 |
| 89.50353291186315 | 0.275 | -0.064 | -0.563 | 0.636 |
| 89.6708813685385 | 0.274 | -0.065 | -0.563 | 0.635 |
| 89.83822982521386 | 0.273 | -0.066 | -0.563 | 0.634 |
| 90.00557828188919 | 0.271 | -0.066 | -0.563 | 0.634 |
| 90.16362960208257 | 0.269 | -0.068 | -0.563 | 0.634 |
| 90.3309780587579 | 0.268 | -0.07 | -0.563 | 0.634 |
| 90.49832651543326 | 0.268 | -0.071 | -0.563 | 0.634 |
| 90.66567497210859 | 0.267 | -0.072 | -0.563 | 0.633 |
| 90.83302342878395 | 0.266 | -0.071 | -0.564 | 0.633 |
| 91.00037188545929 | 0.265 | -0.07 | -0.564 | 0.633 |
| 91.16772034213463 | 0.265 | -0.069 | -0.564 | 0.633 |
| 91.33506879880998 | 0.264 | -0.069 | -0.564 | 0.633 |
| 91.50241725548533 | 0.264 | -0.071 | -0.564 | 0.633 |
| 91.66976571216065 | 0.263 | -0.075 | -0.564 | 0.633 |
| 91.83711416883601 | 0.262 | -0.078 | -0.565 | 0.634 |
| 92.00446262551137 | 0.262 | -0.079 | -0.566 | 0.635 |
| 92.1718110821867 | 0.262 | -0.079 | -0.566 | 0.636 |
| 92.33915953886203 | 0.263 | -0.077 | -0.567 | 0.636 |
| 92.49721085905541 | 0.262 | -0.073 | -0.568 | 0.636 |
| 92.66455931573077 | 0.261 | -0.071 | -0.568 | 0.636 |
| 92.83190777240611 | 0.259 | -0.072 | -0.569 | 0.636 |
| 92.99925622908145 | 0.257 | -0.073 | -0.569 | 0.636 |
| 93.1666046857568 | 0.254 | -0.073 | -0.57 | 0.635 |
| 93.33395314243214 | 0.252 | -0.073 | -0.571 | 0.635 |
| 93.50130159910749 | 0.251 | -0.073 | -0.571 | 0.635 |
| 93.66865005578283 | 0.25 | -0.073 | -0.572 | 0.635 |
| 93.83599851245818 | 0.249 | -0.073 | -0.572 | 0.635 |
| 94.00334696913353 | 0.249 | -0.073 | -0.573 | 0.635 |
| 94.17069542580886 | 0.248 | -0.073 | -0.573 | 0.635 |
| 94.3380438824842 | 0.248 | -0.072 | -0.574 | 0.636 |
| 94.50539233915954 | 0.249 | -0.071 | -0.574 | 0.636 |
| 94.66344365935292 | 0.25 | -0.067 | -0.575 | 0.636 |
| 94.83079211602828 | 0.25 | -0.066 | -0.575 | 0.636 |
| 94.99814057270362 | 0.25 | -0.066 | -0.576 | 0.637 |
| 95.16548902937897 | 0.25 | -0.067 | -0.577 | 0.637 |
| 95.33283748605432 | 0.25 | -0.067 | -0.577 | 0.638 |
| 95.50018594272963 | 0.25 | -0.066 | -0.578 | 0.638 |
| 95.66753439940499 | 0.25 | -0.064 | -0.578 | 0.638 |
| 95.83488285608034 | 0.25 | -0.062 | -0.579 | 0.638 |
| 96.00223131275567 | 0.25 | -0.06 | -0.579 | 0.639 |
| 96.16957976943102 | 0.25 | -0.058 | -0.579 | 0.639 |
| 96.33692822610638 | 0.25 | -0.056 | -0.579 | 0.639 |
| 96.50427668278171 | 0.25 | -0.058 | -0.579 | 0.639 |
| 96.67162513945706 | 0.25 | -0.06 | -0.578 | 0.638 |
| 96.8389735961324 | 0.249 | -0.063 | -0.578 | 0.638 |
| 96.99702491632577 | 0.248 | -0.064 | -0.579 | 0.638 |
| 97.16437337300111 | 0.247 | -0.064 | -0.579 | 0.638 |
| 97.33172182967647 | 0.248 | -0.061 | -0.579 | 0.639 |
| 97.49907028635181 | 0.247 | -0.062 | -0.58 | 0.638 |
| 97.66641874302715 | 0.247 | -0.065 | -0.579 | 0.639 |
| 97.8337671997025 | 0.247 | -0.064 | -0.58 | 0.639 |
| 98.00111565637785 | 0.246 | -0.064 | -0.58 | 0.639 |
| 98.16846411305319 | 0.246 | -0.066 | -0.58 | 0.639 |
| 98.33581256972855 | 0.245 | -0.067 | -0.58 | 0.639 |
| 98.50316102640389 | 0.245 | -0.067 | -0.58 | 0.639 |
| 98.67050948307921 | 0.245 | -0.065 | -0.581 | 0.64 |
| 98.83785793975456 | 0.246 | -0.063 | -0.582 | 0.64 |
| 99.0052063964299 | 0.246 | -0.063 | -0.583 | 0.641 |
| 99.17255485310525 | 0.246 | -0.063 | -0.583 | 0.642 |
| 99.33060617329863 | 0.248 | -0.064 | -0.583 | 0.643 |
| 99.49795462997399 | 0.248 | -0.063 | -0.584 | 0.643 |
| 99.66530308664933 | 0.248 | -0.064 | -0.585 | 0.644 |
| 99.83265154332467 | 0.248 | -0.066 | -0.585 | 0.644 |
| 100.0 | 0.248 | -0.066 | -0.585 | 0.645 |